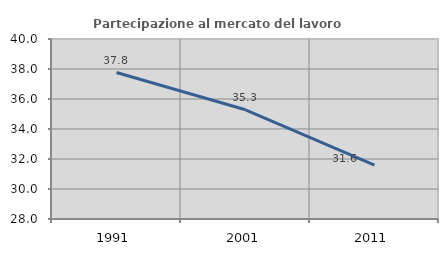
| Category | Partecipazione al mercato del lavoro  femminile |
|---|---|
| 1991.0 | 37.766 |
| 2001.0 | 35.282 |
| 2011.0 | 31.594 |